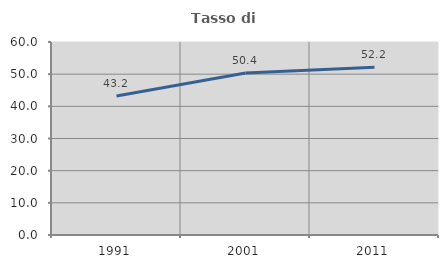
| Category | Tasso di occupazione   |
|---|---|
| 1991.0 | 43.184 |
| 2001.0 | 50.39 |
| 2011.0 | 52.155 |